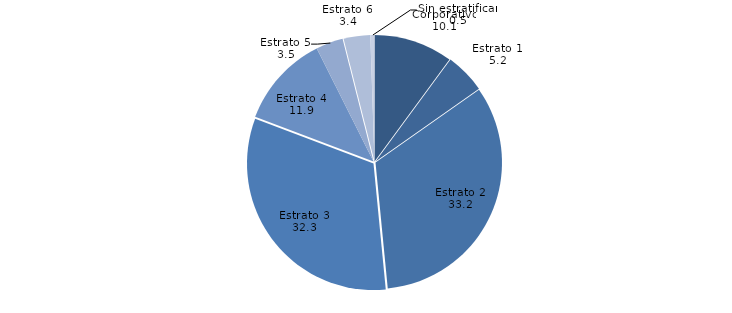
| Category | Series 0 |
|---|---|
| Corporativo | 10.093 |
| Estrato 1 | 5.152 |
| Estrato 2 | 33.209 |
| Estrato 3 | 32.29 |
| Estrato 4 | 11.855 |
| Estrato 5 | 3.465 |
| Estrato 6 | 3.408 |
| Sin estratificar | 0.528 |